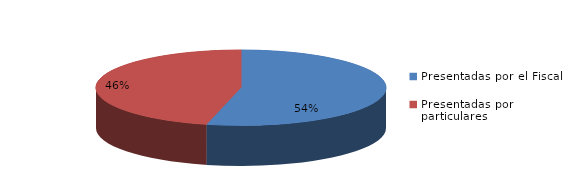
| Category | Series 0 |
|---|---|
| Presentadas por el Fiscal | 149 |
| Presentadas por particulares | 128 |